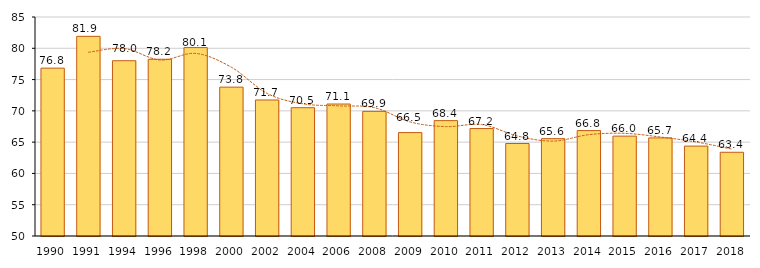
| Category | 76,8246806 81,9070867 78,0122395 78,24405335 80,10996995 73,7902071 71,73776327 70,50518609 71,0909202 69,92316079 66,52634657 68,43706764 67,173839 64,77814091 65,55558079 66,84757009 65,961 65,675 64,371 63,382 |
|---|---|
| 1990.0 | 76.825 |
| 1991.0 | 81.907 |
| 1994.0 | 78.012 |
| 1996.0 | 78.244 |
| 1998.0 | 80.11 |
| 2000.0 | 73.79 |
| 2002.0 | 71.738 |
| 2004.0 | 70.505 |
| 2006.0 | 71.091 |
| 2008.0 | 69.923 |
| 2009.0 | 66.526 |
| 2010.0 | 68.437 |
| 2011.0 | 67.174 |
| 2012.0 | 64.778 |
| 2013.0 | 65.556 |
| 2014.0 | 66.848 |
| 2015.0 | 65.961 |
| 2016.0 | 65.675 |
| 2017.0 | 64.371 |
| 2018.0 | 63.382 |